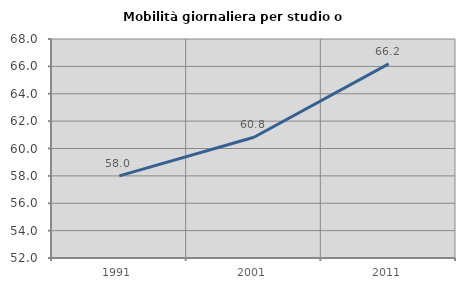
| Category | Mobilità giornaliera per studio o lavoro |
|---|---|
| 1991.0 | 58.004 |
| 2001.0 | 60.825 |
| 2011.0 | 66.179 |